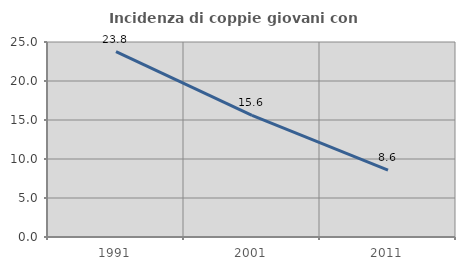
| Category | Incidenza di coppie giovani con figli |
|---|---|
| 1991.0 | 23.763 |
| 2001.0 | 15.58 |
| 2011.0 | 8.567 |